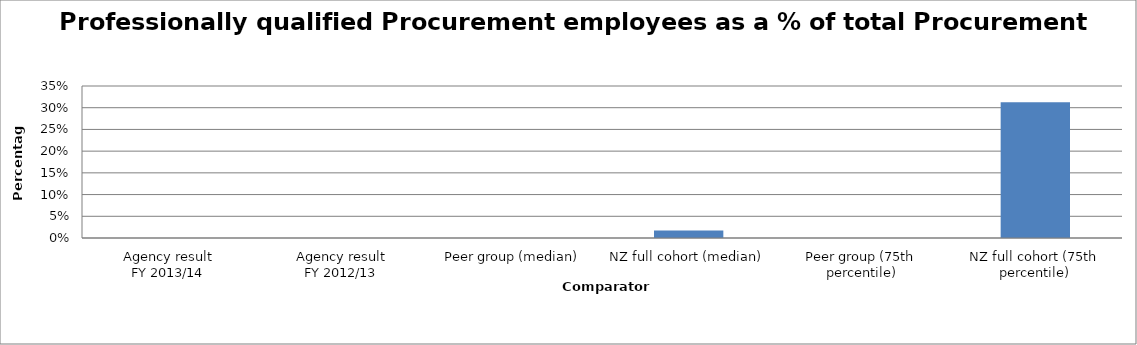
| Category | Series 0 |
|---|---|
| Agency result
FY 2013/14 | 0 |
| Agency result
FY 2012/13 | 0 |
| Peer group (median) | 0 |
| NZ full cohort (median) | 0.018 |
| Peer group (75th percentile) | 0 |
| NZ full cohort (75th percentile) | 0.312 |